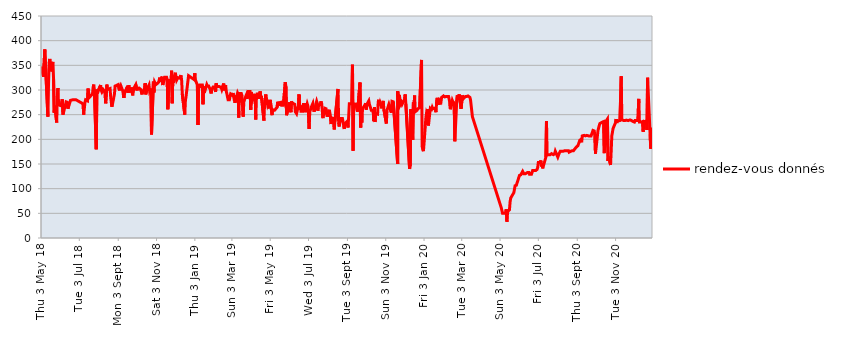
| Category | rendez-vous donnés |
|---|---|
| jeu. 31 déc. 20 | 224 |
| mer. 30 déc. 20 | 193 |
| mar. 29 déc. 20 | 181 |
| lun. 28 déc. 20 | 210 |
| jeu. 24 déc. 20 | 325 |
| mer. 23 déc. 20 | 219 |
| mar. 22 déc. 20 | 237 |
| lun. 21 déc. 20 | 237 |
| ven. 18 déc. 20 | 236 |
| jeu. 17 déc. 20 | 215 |
| mer. 16 déc. 20 | 236 |
| mar. 15 déc. 20 | 237 |
| lun. 14 déc. 20 | 235 |
| ven. 11 déc. 20 | 235 |
| jeu. 10 déc. 20 | 282 |
| mer. 9 déc. 20 | 254 |
| mar. 8 déc. 20 | 238 |
| lun. 7 déc. 20 | 238 |
| ven. 4 déc. 20 | 238 |
| jeu. 3 déc. 20 | 235 |
| mer. 2 déc. 20 | 234 |
| mar. 1 déc. 20 | 236 |
| lun. 30 nov. 20 | 234 |
| ven. 27 nov. 20 | 239 |
| jeu. 26 nov. 20 | 238 |
| mer. 25 nov. 20 | 239 |
| mar. 24 nov. 20 | 238 |
| lun. 23 nov. 20 | 238 |
| ven. 20 nov. 20 | 239 |
| jeu. 19 nov. 20 | 239 |
| mer. 18 nov. 20 | 238 |
| mar. 17 nov. 20 | 238 |
| lun. 16 nov. 20 | 238 |
| ven. 13 nov. 20 | 240 |
| jeu. 12 nov. 20 | 328 |
| mar. 10 nov. 20 | 238 |
| lun. 9 nov. 20 | 240 |
| ven. 6 nov. 20 | 237 |
| jeu. 5 nov. 20 | 233 |
| mer. 4 nov. 20 | 241 |
| mar. 3 nov. 20 | 234 |
| lun. 2 nov. 20 | 234 |
| ven. 30 oct. 20 | 222 |
| jeu. 29 oct. 20 | 220 |
| mer. 28 oct. 20 | 207 |
| mar. 27 oct. 20 | 176 |
| lun. 26 oct. 20 | 148 |
| ven. 23 oct. 20 | 165 |
| jeu. 22 oct. 20 | 156 |
| mer. 21 oct. 20 | 241 |
| mar. 20 oct. 20 | 239 |
| lun. 19 oct. 20 | 237 |
| ven. 16 oct. 20 | 172 |
| jeu. 15 oct. 20 | 236 |
| mer. 14 oct. 20 | 236 |
| mar. 13 oct. 20 | 235 |
| lun. 12 oct. 20 | 236 |
| ven. 9 oct. 20 | 232 |
| jeu. 8 oct. 20 | 228 |
| mer. 7 oct. 20 | 223 |
| mar. 6 oct. 20 | 218 |
| lun. 5 oct. 20 | 217 |
| ven. 2 oct. 20 | 171 |
| jeu. 1 oct. 20 | 210 |
| mer. 30 sept. 20 | 217 |
| mar. 29 sept. 20 | 217 |
| lun. 28 sept. 20 | 218 |
| ven. 25 sept. 20 | 207 |
| jeu. 24 sept. 20 | 207 |
| mer. 23 sept. 20 | 207 |
| mar. 22 sept. 20 | 207 |
| lun. 21 sept. 20 | 207 |
| ven. 18 sept. 20 | 208 |
| jeu. 17 sept. 20 | 208 |
| mer. 16 sept. 20 | 207 |
| mar. 15 sept. 20 | 208 |
| lun. 14 sept. 20 | 208 |
| ven. 11 sept. 20 | 207 |
| jeu. 10 sept. 20 | 194 |
| mer. 9 sept. 20 | 200 |
| mar. 8 sept. 20 | 201 |
| lun. 7 sept. 20 | 198 |
| ven. 4 sept. 20 | 187 |
| jeu. 3 sept. 20 | 185 |
| mer. 2 sept. 20 | 185 |
| mar. 1 sept. 20 | 183 |
| lun. 31 août 20 | 182 |
| ven. 28 août 20 | 177 |
| jeu. 27 août 20 | 176 |
| mer. 26 août 20 | 177 |
| mar. 25 août 20 | 176 |
| lun. 24 août 20 | 176 |
| ven. 21 août 20 | 174 |
| jeu. 20 août 20 | 177 |
| mer. 19 août 20 | 176 |
| mar. 18 août 20 | 177 |
| lun. 17 août 20 | 178 |
| ven. 14 août 20 | 177 |
| jeu. 13 août 20 | 176 |
| mer. 12 août 20 | 176 |
| mar. 11 août 20 | 176 |
| lun. 10 août 20 | 176 |
| ven. 7 août 20 | 176 |
| jeu. 6 août 20 | 176 |
| mer. 5 août 20 | 171 |
| mar. 4 août 20 | 171 |
| lun. 3 août 20 | 164 |
| ven. 31 juil. 20 | 173 |
| jeu. 30 juil. 20 | 176 |
| mer. 29 juil. 20 | 171 |
| mar. 28 juil. 20 | 171 |
| lun. 27 juil. 20 | 169 |
| ven. 24 juil. 20 | 171 |
| jeu. 23 juil. 20 | 169 |
| mer. 22 juil. 20 | 169 |
| mar. 21 juil. 20 | 169 |
| lun. 20 juil. 20 | 169 |
| ven. 17 juil. 20 | 169 |
| jeu. 16 juil. 20 | 237 |
| mer. 15 juil. 20 | 164 |
| ven. 10 juil. 20 | 141 |
| jeu. 9 juil. 20 | 151 |
| mer. 8 juil. 20 | 145 |
| mar. 7 juil. 20 | 157 |
| lun. 6 juil. 20 | 153 |
| ven. 3 juil. 20 | 153 |
| jeu. 2 juil. 20 | 143 |
| mer. 1 juil. 20 | 139 |
| mar. 30 juin 20 | 139 |
| lun. 29 juin 20 | 137 |
| ven. 26 juin 20 | 137 |
| jeu. 25 juin 20 | 137 |
| mer. 24 juin 20 | 137 |
| mar. 23 juin 20 | 137 |
| lun. 22 juin 20 | 129 |
| ven. 19 juin 20 | 129 |
| jeu. 18 juin 20 | 133 |
| mer. 17 juin 20 | 132 |
| mar. 16 juin 20 | 133 |
| lun. 15 juin 20 | 132 |
| ven. 12 juin 20 | 130 |
| jeu. 11 juin 20 | 128 |
| mer. 10 juin 20 | 130 |
| mar. 9 juin 20 | 129 |
| lun. 8 juin 20 | 135 |
| ven. 5 juin 20 | 128 |
| jeu. 4 juin 20 | 129 |
| mer. 3 juin 20 | 127 |
| mar. 2 juin 20 | 126 |
| ven. 29 mai 20 | 107 |
| jeu. 28 mai 20 | 106 |
| mer. 27 mai 20 | 106 |
| mar. 26 mai 20 | 107 |
| lun. 25 mai 20 | 92 |
| mer. 20 mai 20 | 81 |
| mar. 19 mai 20 | 73 |
| lun. 18 mai 20 | 57 |
| ven. 15 mai 20 | 53 |
| jeu. 14 mai 20 | 33 |
| mer. 13 mai 20 | 58 |
| mar. 12 mai 20 | 50 |
| lun. 11 mai 20 | 50 |
| jeu. 7 mai 20 | 50 |
| mer. 6 mai 20 | 50 |
| mar. 5 mai 20 | 61 |
| ven. 20 mars 20 | 246 |
| mar. 17 mars 20 | 280 |
| lun. 16 mars 20 | 285 |
| ven. 13 mars 20 | 288 |
| jeu. 12 mars 20 | 287 |
| mer. 11 mars 20 | 287 |
| mar. 10 mars 20 | 288 |
| lun. 9 mars 20 | 287 |
| ven. 6 mars 20 | 283 |
| jeu. 5 mars 20 | 286 |
| mer. 4 mars 20 | 289 |
| mar. 3 mars 20 | 289 |
| lun. 2 mars 20 | 262 |
| ven. 28 févr. 20 | 291 |
| jeu. 27 févr. 20 | 293 |
| mer. 26 févr. 20 | 280 |
| mar. 25 févr. 20 | 289 |
| lun. 24 févr. 20 | 276 |
| ven. 21 févr. 20 | 196 |
| jeu. 20 févr. 20 | 274 |
| mer. 19 févr. 20 | 275 |
| mar. 18 févr. 20 | 276 |
| lun. 17 févr. 20 | 279 |
| ven. 14 févr. 20 | 261 |
| jeu. 13 févr. 20 | 275 |
| mer. 12 févr. 20 | 276 |
| mar. 11 févr. 20 | 287 |
| lun. 10 févr. 20 | 286 |
| ven. 7 févr. 20 | 287 |
| jeu. 6 févr. 20 | 286 |
| mer. 5 févr. 20 | 286 |
| mar. 4 févr. 20 | 285 |
| lun. 3 févr. 20 | 288 |
| ven. 31 janv. 20 | 285 |
| jeu. 30 janv. 20 | 276 |
| mer. 29 janv. 20 | 277 |
| mar. 28 janv. 20 | 279 |
| lun. 27 janv. 20 | 270 |
| ven. 24 janv. 20 | 284 |
| jeu. 23 janv. 20 | 275 |
| mer. 22 janv. 20 | 255 |
| mar. 21 janv. 20 | 263 |
| lun. 20 janv. 20 | 265 |
| ven. 17 janv. 20 | 262 |
| jeu. 16 janv. 20 | 265 |
| mer. 15 janv. 20 | 261 |
| mar. 14 janv. 20 | 260 |
| lun. 13 janv. 20 | 263 |
| ven. 10 janv. 20 | 228 |
| jeu. 9 janv. 20 | 261 |
| mer. 8 janv. 20 | 251 |
| mar. 7 janv. 20 | 254 |
| lun. 6 janv. 20 | 245 |
| ven. 3 janv. 20 | 192 |
| jeu. 2 janv. 20 | 176 |
| mar. 31 déc. 19 | 186 |
| lun. 30 déc. 19 | 361 |
| ven. 27 déc. 19 | 264 |
| jeu. 26 déc. 19 | 262 |
| mar. 24 déc. 19 | 262 |
| lun. 23 déc. 19 | 259 |
| ven. 20 déc. 19 | 256 |
| jeu. 19 déc. 19 | 289 |
| mer. 18 déc. 19 | 266 |
| mar. 17 déc. 19 | 275 |
| lun. 16 déc. 19 | 199 |
| ven. 13 déc. 19 | 261 |
| jeu. 12 déc. 19 | 146 |
| mer. 11 déc. 19 | 140 |
| jeu. 5 déc. 19 | 272 |
| mer. 4 déc. 19 | 291 |
| mar. 3 déc. 19 | 281 |
| lun. 2 déc. 19 | 283 |
| ven. 29 nov. 19 | 271 |
| jeu. 28 nov. 19 | 275 |
| mer. 27 nov. 19 | 277 |
| mar. 26 nov. 19 | 270 |
| lun. 25 nov. 19 | 288 |
| ven. 22 nov. 19 | 291 |
| ven. 22 nov. 19 | 297 |
| ven. 22 nov. 19 | 287 |
| ven. 22 nov. 19 | 297 |
| ven. 22 nov. 19 | 150 |
| ven. 15 nov. 19 | 276 |
| jeu. 14 nov. 19 | 277 |
| mer. 13 nov. 19 | 277 |
| mar. 12 nov. 19 | 254 |
| ven. 8 nov. 19 | 271 |
| jeu. 7 nov. 19 | 273 |
| mar. 5 nov. 19 | 259 |
| lun. 4 nov. 19 | 232 |
| jeu. 31 oct. 19 | 261 |
| mer. 30 oct. 19 | 278 |
| mar. 29 oct. 19 | 278 |
| lun. 28 oct. 19 | 263 |
| ven. 25 oct. 19 | 274 |
| jeu. 24 oct. 19 | 269 |
| mer. 23 oct. 19 | 280 |
| mar. 22 oct. 19 | 275 |
| lun. 21 oct. 19 | 251 |
| ven. 18 oct. 19 | 252 |
| jeu. 17 oct. 19 | 235 |
| mer. 16 oct. 19 | 265 |
| mar. 15 oct. 19 | 237 |
| lun. 14 oct. 19 | 259 |
| ven. 11 oct. 19 | 259 |
| mer. 9 oct. 19 | 267 |
| mar. 8 oct. 19 | 271 |
| lun. 7 oct. 19 | 278 |
| ven. 4 oct. 19 | 271 |
| jeu. 3 oct. 19 | 260 |
| mer. 2 oct. 19 | 273 |
| mar. 1 oct. 19 | 270 |
| lun. 30 sept. 19 | 268 |
| ven. 27 sept. 19 | 262 |
| jeu. 26 sept. 19 | 234 |
| mer. 25 sept. 19 | 263 |
| mar. 24 sept. 19 | 224 |
| lun. 23 sept. 19 | 315 |
| ven. 20 sept. 19 | 269 |
| jeu. 19 sept. 19 | 256 |
| mar. 17 sept. 19 | 271 |
| lun. 16 sept. 19 | 271 |
| ven. 13 sept. 19 | 272 |
| jeu. 12 sept. 19 | 177 |
| mer. 11 sept. 19 | 351 |
| mar. 10 sept. 19 | 272 |
| lun. 9 sept. 19 | 271 |
| ven. 6 sept. 19 | 272 |
| jeu. 5 sept. 19 | 247 |
| mer. 4 sept. 19 | 224 |
| mar. 3 sept. 19 | 237 |
| lun. 2 sept. 19 | 235 |
| ven. 30 août 19 | 232 |
| jeu. 29 août 19 | 221 |
| mer. 28 août 19 | 229 |
| mar. 27 août 19 | 236 |
| lun. 26 août 19 | 242 |
| ven. 23 août 19 | 242 |
| jeu. 22 août 19 | 240 |
| mer. 21 août 19 | 226 |
| mar. 20 août 19 | 234 |
| lun. 19 août 19 | 302 |
| mer. 14 août 19 | 236 |
| mar. 13 août 19 | 220 |
| lun. 12 août 19 | 245 |
| ven. 9 août 19 | 235 |
| jeu. 8 août 19 | 231 |
| mer. 7 août 19 | 246 |
| mar. 6 août 19 | 254 |
| lun. 5 août 19 | 260 |
| ven. 2 août 19 | 246 |
| jeu. 1 août 19 | 253 |
| mer. 31 juil. 19 | 262 |
| mar. 30 juil. 19 | 264 |
| lun. 29 juil. 19 | 263 |
| ven. 26 juil. 19 | 243 |
| jeu. 25 juil. 19 | 258 |
| mer. 24 juil. 19 | 272 |
| mar. 23 juil. 19 | 277 |
| lun. 22 juil. 19 | 270 |
| ven. 19 juil. 19 | 269 |
| jeu. 18 juil. 19 | 258 |
| mer. 17 juil. 19 | 273 |
| mar. 16 juil. 19 | 277 |
| lun. 15 juil. 19 | 275 |
| ven. 12 juil. 19 | 256 |
| jeu. 11 juil. 19 | 265 |
| mer. 10 juil. 19 | 273 |
| mar. 9 juil. 19 | 274 |
| lun. 8 juil. 19 | 267 |
| ven. 5 juil. 19 | 256 |
| jeu. 4 juil. 19 | 221 |
| mer. 3 juil. 19 | 251 |
| mar. 2 juil. 19 | 268 |
| lun. 1 juil. 19 | 272 |
| ven. 28 juin 19 | 255 |
| jeu. 27 juin 19 | 273 |
| mer. 26 juin 19 | 257 |
| mar. 25 juin 19 | 273 |
| lun. 24 juin 19 | 257 |
| ven. 21 juin 19 | 257 |
| jeu. 20 juin 19 | 269 |
| mer. 19 juin 19 | 260 |
| mar. 18 juin 19 | 291 |
| lun. 17 juin 19 | 269 |
| ven. 14 juin 19 | 252 |
| mer. 12 juin 19 | 256 |
| mar. 11 juin 19 | 271 |
| ven. 7 juin 19 | 274 |
| jeu. 6 juin 19 | 277 |
| mer. 5 juin 19 | 255 |
| mar. 4 juin 19 | 262 |
| lun. 3 juin 19 | 275 |
| mer. 29 mai 19 | 249 |
| mar. 28 mai 19 | 307 |
| lun. 27 mai 19 | 316 |
| ven. 24 mai 19 | 269 |
| jeu. 23 mai 19 | 267 |
| mar. 21 mai 19 | 269 |
| lun. 20 mai 19 | 275 |
| ven. 17 mai 19 | 274 |
| jeu. 16 mai 19 | 268 |
| mer. 15 mai 19 | 276 |
| mar. 14 mai 19 | 265 |
| ven. 10 mai 19 | 259 |
| mar. 7 mai 19 | 260 |
| lun. 6 mai 19 | 249 |
| ven. 3 mai 19 | 280 |
| jeu. 2 mai 19 | 263 |
| mar. 30 avr. 19 | 272 |
| lun. 29 avr. 19 | 269 |
| ven. 26 avr. 19 | 291 |
| jeu. 25 avr. 19 | 293 |
| mer. 24 avr. 19 | 270 |
| mar. 23 avr. 19 | 238 |
| ven. 19 avr. 19 | 288 |
| jeu. 18 avr. 19 | 282 |
| mer. 17 avr. 19 | 297 |
| mar. 16 avr. 19 | 282 |
| lun. 15 avr. 19 | 292 |
| ven. 12 avr. 19 | 292 |
| jeu. 11 avr. 19 | 281 |
| mer. 10 avr. 19 | 240 |
| mar. 9 avr. 19 | 292 |
| ven. 5 avr. 19 | 280 |
| jeu. 4 avr. 19 | 288 |
| mer. 3 avr. 19 | 296 |
| mar. 2 avr. 19 | 260 |
| lun. 1 avr. 19 | 297 |
| ven. 29 mars 19 | 297 |
| jeu. 28 mars 19 | 295 |
| mer. 27 mars 19 | 282 |
| mar. 26 mars 19 | 290 |
| lun. 25 mars 19 | 287 |
| ven. 22 mars 19 | 276 |
| jeu. 21 mars 19 | 246 |
| mer. 20 mars 19 | 268 |
| mar. 19 mars 19 | 289 |
| lun. 18 mars 19 | 293 |
| ven. 15 mars 19 | 293 |
| jeu. 14 mars 19 | 244 |
| mer. 13 mars 19 | 291 |
| mar. 12 mars 19 | 294 |
| lun. 11 mars 19 | 295 |
| ven. 8 mars 19 | 274 |
| jeu. 7 mars 19 | 289 |
| mer. 6 mars 19 | 286 |
| mar. 5 mars 19 | 294 |
| lun. 4 mars 19 | 289 |
| ven. 1 mars 19 | 292 |
| jeu. 28 févr. 19 | 287 |
| mer. 27 févr. 19 | 280 |
| mar. 26 févr. 19 | 282 |
| lun. 25 févr. 19 | 280 |
| ven. 22 févr. 19 | 298 |
| jeu. 21 févr. 19 | 310 |
| mer. 20 févr. 19 | 304 |
| mar. 19 févr. 19 | 299 |
| lun. 18 févr. 19 | 313 |
| ven. 15 févr. 19 | 301 |
| jeu. 14 févr. 19 | 305 |
| mer. 13 févr. 19 | 307 |
| lun. 11 févr. 19 | 307 |
| jeu. 7 févr. 19 | 307 |
| mer. 6 févr. 19 | 314 |
| mar. 5 févr. 19 | 296 |
| lun. 4 févr. 19 | 306 |
| ven. 1 févr. 19 | 306 |
| jeu. 31 janv. 19 | 308 |
| mer. 30 janv. 19 | 301 |
| mar. 29 janv. 19 | 293 |
| lun. 28 janv. 19 | 300 |
| ven. 25 janv. 19 | 308 |
| jeu. 24 janv. 19 | 308 |
| mer. 23 janv. 19 | 308 |
| mar. 22 janv. 19 | 311 |
| lun. 21 janv. 19 | 312 |
| ven. 18 janv. 19 | 294 |
| jeu. 17 janv. 19 | 307 |
| mer. 16 janv. 19 | 271 |
| mar. 15 janv. 19 | 310 |
| lun. 14 janv. 19 | 312 |
| ven. 11 janv. 19 | 310 |
| jeu. 10 janv. 19 | 304 |
| mer. 9 janv. 19 | 311 |
| mar. 8 janv. 19 | 229 |
| lun. 7 janv. 19 | 310 |
| ven. 4 janv. 19 | 320 |
| jeu. 3 janv. 19 | 334 |
| mer. 2 janv. 19 | 321 |
| lun. 24 déc. 18 | 329 |
| jeu. 20 déc. 18 | 287 |
| mer. 19 déc. 18 | 279 |
| mar. 18 déc. 18 | 250 |
| lun. 17 déc. 18 | 250 |
| ven. 14 déc. 18 | 292 |
| jeu. 13 déc. 18 | 319 |
| mer. 12 déc. 18 | 330 |
| mar. 11 déc. 18 | 328 |
| lun. 10 déc. 18 | 324 |
| ven. 7 déc. 18 | 325 |
| jeu. 6 déc. 18 | 323 |
| mer. 5 déc. 18 | 320 |
| mar. 4 déc. 18 | 327 |
| lun. 3 déc. 18 | 335 |
| ven. 30 nov. 18 | 315 |
| jeu. 29 nov. 18 | 329 |
| mer. 28 nov. 18 | 273 |
| mar. 27 nov. 18 | 339 |
| lun. 26 nov. 18 | 313 |
| ven. 23 nov. 18 | 322 |
| jeu. 22 nov. 18 | 320 |
| mer. 21 nov. 18 | 261 |
| mar. 20 nov. 18 | 321 |
| lun. 19 nov. 18 | 326 |
| ven. 16 nov. 18 | 326 |
| jeu. 15 nov. 18 | 320 |
| mer. 14 nov. 18 | 320 |
| mar. 13 nov. 18 | 310 |
| lun. 12 nov. 18 | 327 |
| ven. 9 nov. 18 | 317 |
| jeu. 8 nov. 18 | 325 |
| mer. 7 nov. 18 | 317 |
| mar. 6 nov. 18 | 319 |
| lun. 5 nov. 18 | 314 |
| ven. 2 nov. 18 | 311 |
| mer. 31 oct. 18 | 316 |
| mar. 30 oct. 18 | 295 |
| lun. 29 oct. 18 | 317 |
| ven. 26 oct. 18 | 210 |
| jeu. 25 oct. 18 | 303 |
| mer. 24 oct. 18 | 303 |
| mar. 23 oct. 18 | 298 |
| lun. 22 oct. 18 | 310 |
| ven. 19 oct. 18 | 302 |
| jeu. 18 oct. 18 | 300 |
| mer. 17 oct. 18 | 291 |
| mar. 16 oct. 18 | 314 |
| lun. 15 oct. 18 | 303 |
| ven. 12 oct. 18 | 296 |
| jeu. 11 oct. 18 | 291 |
| mar. 9 oct. 18 | 301 |
| lun. 8 oct. 18 | 301 |
| sam. 6 oct. 18 | 304 |
| jeu. 4 oct. 18 | 303 |
| mer. 3 oct. 18 | 299 |
| mar. 2 oct. 18 | 301 |
| lun. 1 oct. 18 | 311 |
| ven. 28 sept. 18 | 304 |
| jeu. 27 sept. 18 | 303 |
| mer. 26 sept. 18 | 289 |
| mar. 25 sept. 18 | 305 |
| lun. 24 sept. 18 | 296 |
| ven. 21 sept. 18 | 300 |
| jeu. 20 sept. 18 | 310 |
| mer. 19 sept. 18 | 294 |
| mar. 18 sept. 18 | 308 |
| lun. 17 sept. 18 | 310 |
| ven. 14 sept. 18 | 296 |
| jeu. 13 sept. 18 | 299 |
| mer. 12 sept. 18 | 284 |
| mar. 11 sept. 18 | 293 |
| lun. 10 sept. 18 | 299 |
| ven. 7 sept. 18 | 309 |
| jeu. 6 sept. 18 | 306 |
| mer. 5 sept. 18 | 299 |
| mar. 4 sept. 18 | 301 |
| lun. 3 sept. 18 | 311 |
| ven. 31 août 18 | 309 |
| jeu. 30 août 18 | 309 |
| mer. 29 août 18 | 308 |
| mar. 28 août 18 | 292 |
| lun. 27 août 18 | 290 |
| ven. 24 août 18 | 266 |
| jeu. 23 août 18 | 275 |
| mer. 22 août 18 | 285 |
| mar. 21 août 18 | 303 |
| ven. 17 août 18 | 301 |
| jeu. 16 août 18 | 311 |
| mar. 14 août 18 | 273 |
| lun. 13 août 18 | 296 |
| ven. 10 août 18 | 301 |
| jeu. 9 août 18 | 301 |
| mer. 8 août 18 | 296 |
| mar. 7 août 18 | 299 |
| lun. 6 août 18 | 310 |
| ven. 3 août 18 | 301 |
| jeu. 2 août 18 | 301 |
| mer. 1 août 18 | 293 |
| mar. 31 juil. 18 | 301 |
| lun. 30 juil. 18 | 180 |
| ven. 27 juil. 18 | 301 |
| jeu. 26 juil. 18 | 311 |
| mer. 25 juil. 18 | 304 |
| mar. 24 juil. 18 | 292 |
| lun. 23 juil. 18 | 292 |
| jeu. 19 juil. 18 | 285 |
| mer. 18 juil. 18 | 294 |
| mar. 17 juil. 18 | 303 |
| lun. 16 juil. 18 | 278 |
| ven. 13 juil. 18 | 280 |
| jeu. 12 juil. 18 | 275 |
| mer. 11 juil. 18 | 262 |
| mar. 10 juil. 18 | 250 |
| lun. 9 juil. 18 | 272 |
| jeu. 28 juin 18 | 280 |
| ven. 22 juin 18 | 280 |
| mar. 19 juin 18 | 279 |
| ven. 15 juin 18 | 262 |
| jeu. 14 juin 18 | 275 |
| mer. 13 juin 18 | 275 |
| mar. 12 juin 18 | 276 |
| jeu. 7 juin 18 | 250 |
| mer. 6 juin 18 | 281 |
| mar. 5 juin 18 | 282 |
| lun. 4 juin 18 | 268 |
| jeu. 31 mai 18 | 270 |
| mer. 30 mai 18 | 304 |
| mar. 29 mai 18 | 286 |
| lun. 28 mai 18 | 234 |
| ven. 25 mai 18 | 268 |
| jeu. 24 mai 18 | 254 |
| mer. 23 mai 18 | 322 |
| mar. 22 mai 18 | 357 |
| ven. 18 mai 18 | 338 |
| jeu. 17 mai 18 | 363 |
| mer. 16 mai 18 | 354 |
| mar. 15 mai 18 | 313 |
| lun. 14 mai 18 | 246 |
| mer. 9 mai 18 | 382 |
| lun. 7 mai 18 | 327 |
| ven. 4 mai 18 | 347 |
| jeu. 3 mai 18 | 335 |